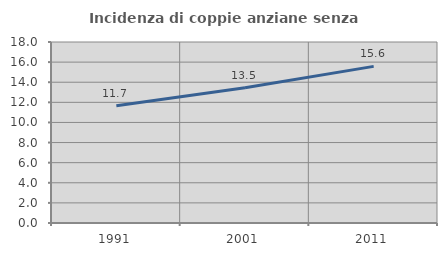
| Category | Incidenza di coppie anziane senza figli  |
|---|---|
| 1991.0 | 11.654 |
| 2001.0 | 13.455 |
| 2011.0 | 15.577 |